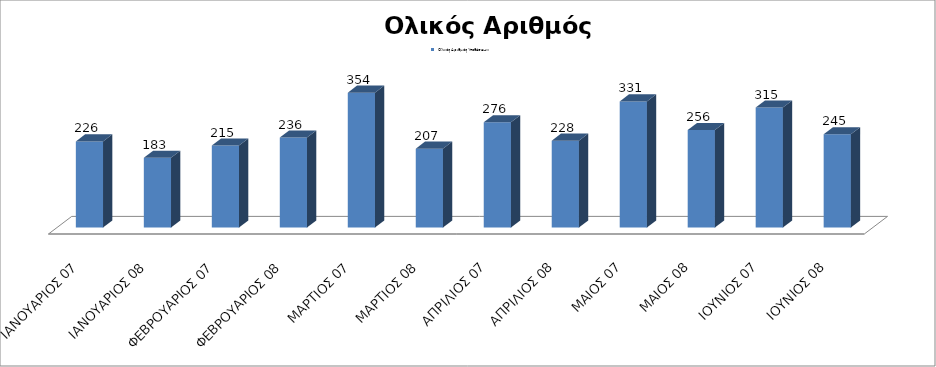
| Category | Ολικός Αριθμός Υποθέσεων: |
|---|---|
| ΙΑΝΟΥΑΡΙΟΣ 07 | 226 |
| ΙΑΝΟΥΑΡΙΟΣ 08 | 183 |
| ΦΕΒΡΟΥΑΡΙΟΣ 07 | 215 |
| ΦΕΒΡΟΥΑΡΙΟΣ 08 | 236 |
| ΜΑΡΤΙΟΣ 07 | 354 |
| ΜΑΡΤΙΟΣ 08 | 207 |
| ΑΠΡΙΛΙΟΣ 07 | 276 |
| ΑΠΡΙΛΙΟΣ 08 | 228 |
| ΜΑΙΟΣ 07 | 331 |
| ΜΑΙΟΣ 08 | 256 |
| ΙΟΥΝΙΟΣ 07 | 315 |
| ΙΟΥΝΙΟΣ 08 | 245 |